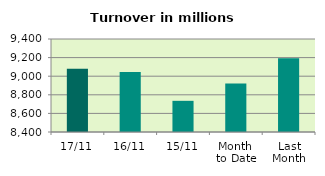
| Category | Series 0 |
|---|---|
| 17/11 | 9079.892 |
| 16/11 | 9046.07 |
| 15/11 | 8735.157 |
| Month 
to Date | 8922.167 |
| Last
Month | 9192.028 |